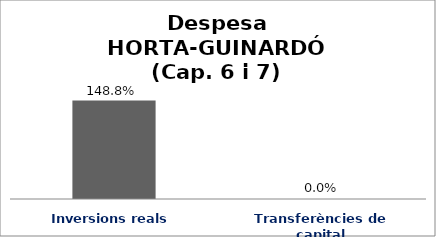
| Category | Series 0 |
|---|---|
| Inversions reals | 1.488 |
| Transferències de capital | 0 |